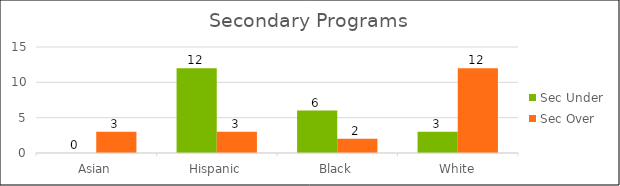
| Category | Sec Under | Sec Over |
|---|---|---|
| Asian | 0 | 3 |
| Hispanic | 12 | 3 |
| Black | 6 | 2 |
| White | 3 | 12 |